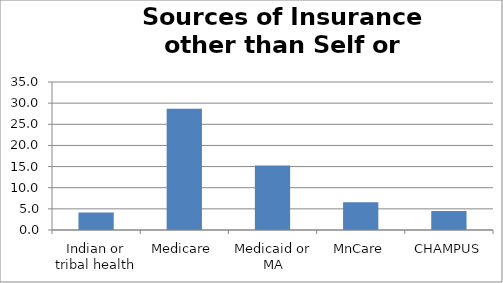
| Category | Series 0 |
|---|---|
| Indian or tribal health | 4.143 |
| Medicare | 28.653 |
| Medicaid or MA | 15.279 |
| MnCare | 6.566 |
| CHAMPUS | 4.476 |